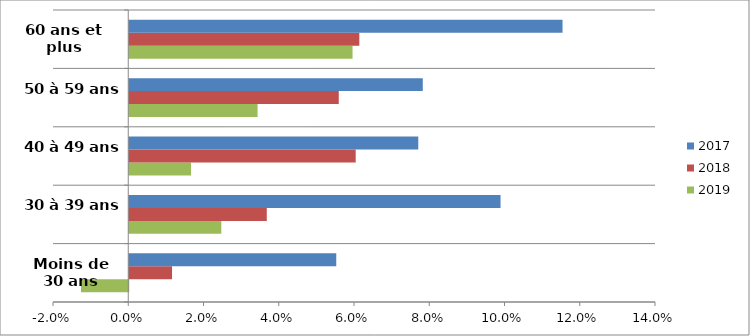
| Category | 2019 | 2018 | 2017 |
|---|---|---|---|
| Moins de 30 ans | -0.013 | 0.011 | 0.055 |
| 30 à 39 ans | 0.024 | 0.037 | 0.099 |
| 40 à 49 ans | 0.016 | 0.06 | 0.077 |
| 50 à 59 ans | 0.034 | 0.056 | 0.078 |
| 60 ans et plus | 0.059 | 0.061 | 0.115 |